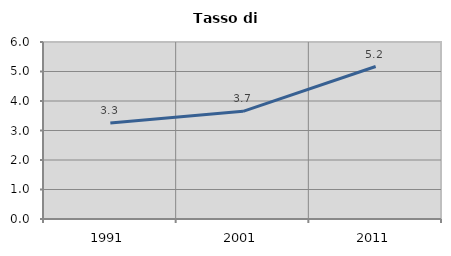
| Category | Tasso di disoccupazione   |
|---|---|
| 1991.0 | 3.252 |
| 2001.0 | 3.65 |
| 2011.0 | 5.168 |